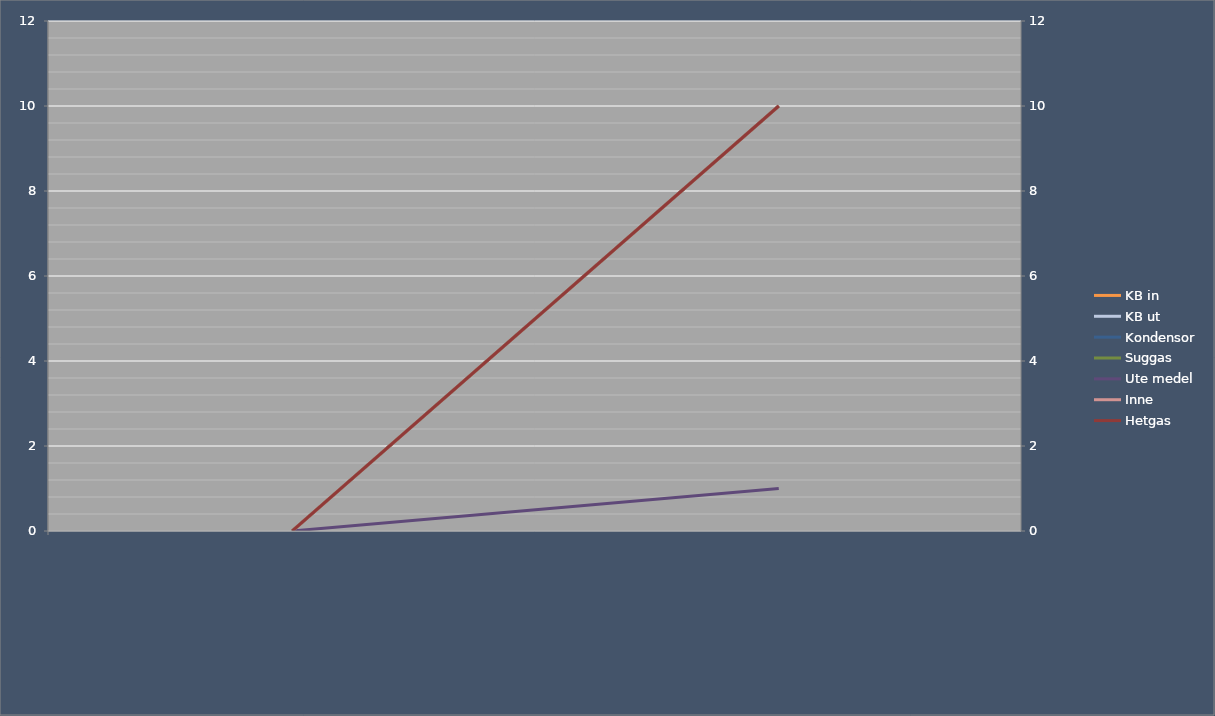
| Category | KB in | KB ut | Kondensor | Suggas | Ute medel | Inne |
|---|---|---|---|---|---|---|
|  | 0 | 0 | 0 | 0 | 0 | 0 |
|  | 10 | 10 | 10 | 10 | 1 | 10 |